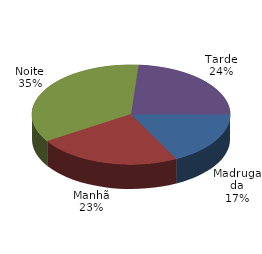
| Category | Qtde Acidentes |
|---|---|
| Madrugada | 266 |
| Manhã | 357 |
| Noite | 538 |
| Tarde | 362 |